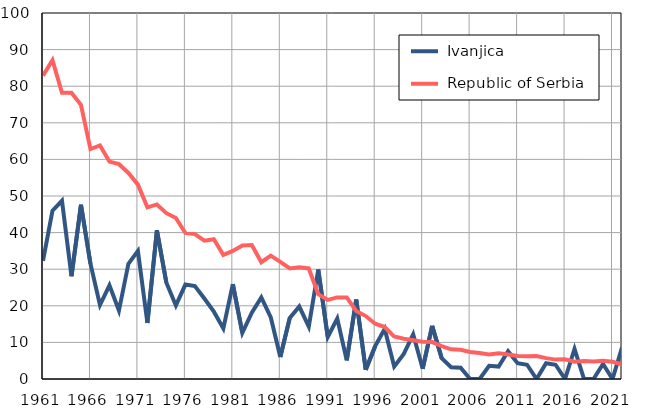
| Category |  Ivanjica |  Republic of Serbia |
|---|---|---|
| 1961.0 | 32.3 | 82.9 |
| 1962.0 | 46 | 87.1 |
| 1963.0 | 48.7 | 78.2 |
| 1964.0 | 28.1 | 78.2 |
| 1965.0 | 47.6 | 74.9 |
| 1966.0 | 31.5 | 62.8 |
| 1967.0 | 20.2 | 63.8 |
| 1968.0 | 25.6 | 59.4 |
| 1969.0 | 18.7 | 58.7 |
| 1970.0 | 31.5 | 56.3 |
| 1971.0 | 35 | 53.1 |
| 1972.0 | 15.3 | 46.9 |
| 1973.0 | 40.6 | 47.7 |
| 1974.0 | 26.3 | 45.3 |
| 1975.0 | 20.1 | 44 |
| 1976.0 | 25.8 | 39.9 |
| 1977.0 | 25.4 | 39.6 |
| 1978.0 | 22 | 37.8 |
| 1979.0 | 18.4 | 38.2 |
| 1980.0 | 13.8 | 33.9 |
| 1981.0 | 25.9 | 35 |
| 1982.0 | 12.6 | 36.5 |
| 1983.0 | 18.1 | 36.6 |
| 1984.0 | 22.3 | 31.9 |
| 1985.0 | 16.8 | 33.7 |
| 1986.0 | 6 | 32 |
| 1987.0 | 16.7 | 30.2 |
| 1988.0 | 19.8 | 30.5 |
| 1989.0 | 14.3 | 30.2 |
| 1990.0 | 29.9 | 23.2 |
| 1991.0 | 11.5 | 21.6 |
| 1992.0 | 16.5 | 22.3 |
| 1993.0 | 5.1 | 22.3 |
| 1994.0 | 21.7 | 18.6 |
| 1995.0 | 2.5 | 17.2 |
| 1996.0 | 9 | 15.1 |
| 1997.0 | 13.7 | 14.2 |
| 1998.0 | 3.4 | 11.6 |
| 1999.0 | 6.8 | 11 |
| 2000.0 | 12.2 | 10.6 |
| 2001.0 | 2.8 | 10.2 |
| 2002.0 | 14.5 | 10.1 |
| 2003.0 | 5.7 | 9 |
| 2004.0 | 3.2 | 8.1 |
| 2005.0 | 3.1 | 8 |
| 2006.0 | 0 | 7.4 |
| 2007.0 | 0 | 7.1 |
| 2008.0 | 3.6 | 6.7 |
| 2009.0 | 3.4 | 7 |
| 2010.0 | 7.6 | 6.7 |
| 2011.0 | 4.3 | 6.3 |
| 2012.0 | 3.9 | 6.2 |
| 2013.0 | 0 | 6.3 |
| 2014.0 | 4.3 | 5.7 |
| 2015.0 | 3.9 | 5.3 |
| 2016.0 | 0 | 5.4 |
| 2017.0 | 8.2 | 4.7 |
| 2018.0 | 0 | 4.9 |
| 2019.0 | 0 | 4.8 |
| 2020.0 | 4.1 | 5 |
| 2021.0 | 0 | 4.7 |
| 2022.0 | 8.6 | 4 |